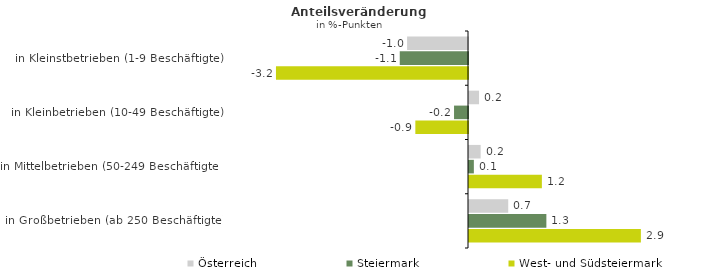
| Category | Österreich | Steiermark | West- und Südsteiermark |
|---|---|---|---|
| in Kleinstbetrieben (1-9 Beschäftigte) | -1.011 | -1.133 | -3.187 |
| in Kleinbetrieben (10-49 Beschäftigte) | 0.167 | -0.232 | -0.874 |
| in Mittelbetrieben (50-249 Beschäftigte) | 0.193 | 0.081 | 1.21 |
| in Großbetrieben (ab 250 Beschäftigte) | 0.651 | 1.284 | 2.853 |